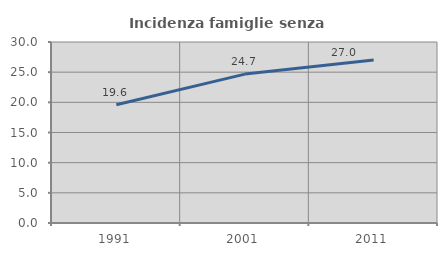
| Category | Incidenza famiglie senza nuclei |
|---|---|
| 1991.0 | 19.604 |
| 2001.0 | 24.678 |
| 2011.0 | 27.033 |